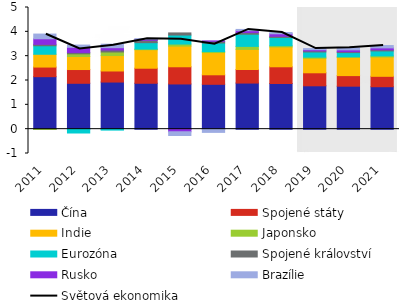
| Category | Čína | Spojené státy | Indie | Japonsko | Eurozóna | Spojené království | Rusko | Brazílie |
|---|---|---|---|---|---|---|---|---|
| 2011.0 | 2.157 | 0.395 | 0.526 | -0.009 | 0.349 | 0.059 | 0.228 | 0.194 |
| 2012.0 | 1.885 | 0.566 | 0.535 | 0.11 | -0.158 | 0.056 | 0.211 | 0.092 |
| 2013.0 | 1.936 | 0.454 | 0.635 | 0.146 | -0.039 | 0.081 | 0.096 | 0.143 |
| 2014.0 | 1.887 | 0.618 | 0.76 | 0.026 | 0.264 | 0.097 | 0.04 | 0.023 |
| 2015.0 | 1.858 | 0.706 | 0.85 | 0.084 | 0.371 | 0.087 | -0.107 | -0.153 |
| 2016.0 | 1.843 | 0.391 | 0.913 | 0.041 | 0.352 | 0.07 | 0.015 | -0.132 |
| 2017.0 | 1.895 | 0.558 | 0.826 | 0.124 | 0.5 | 0.068 | 0.076 | 0.052 |
| 2018.0 | 1.876 | 0.687 | 0.815 | 0.049 | 0.342 | 0.048 | 0.103 | 0.051 |
| 2019.0 | 1.782 | 0.535 | 0.595 | 0.048 | 0.212 | 0.044 | 0.05 | 0.046 |
| 2020.0 | 1.767 | 0.435 | 0.748 | 0.023 | 0.173 | 0.037 | 0.075 | 0.083 |
| 2021.0 | 1.745 | 0.428 | 0.794 | 0.046 | 0.204 | 0.046 | 0.079 | 0.097 |